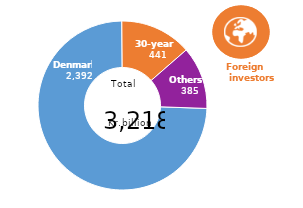
| Category | Series 0 |
|---|---|
| Denmark | 2391.628 |
| 30-year fixed-rate | 441.447 |
| Others | 385.132 |